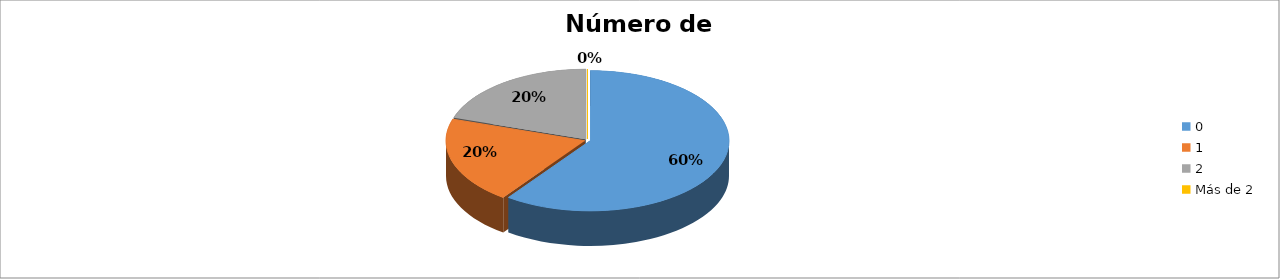
| Category | Series 0 |
|---|---|
| 0 | 0.6 |
| 1 | 0.2 |
| 2 | 0.2 |
| Más de 2 | 0 |